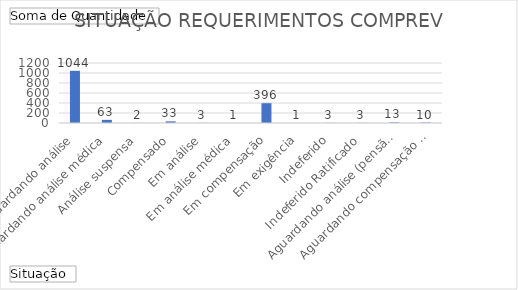
| Category | Total |
|---|---|
| Aguardando análise | 1044 |
| Aguardando análise médica | 63 |
| Análise suspensa | 2 |
| Compensado | 33 |
| Em análise | 3 |
| Em análise médica | 1 |
| Em compensação | 396 |
| Em exigência | 1 |
| Indeferido | 3 |
| Indeferido Ratificado | 3 |
| Aguardando análise (pensão) | 13 |
| Aguardando compensação da aposentadoria (´pensão) | 10 |